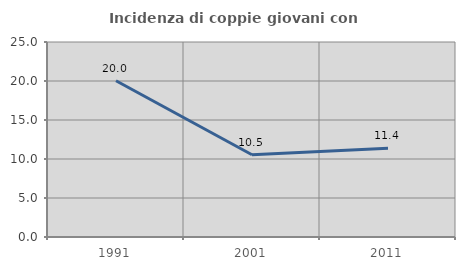
| Category | Incidenza di coppie giovani con figli |
|---|---|
| 1991.0 | 20.028 |
| 2001.0 | 10.539 |
| 2011.0 | 11.379 |